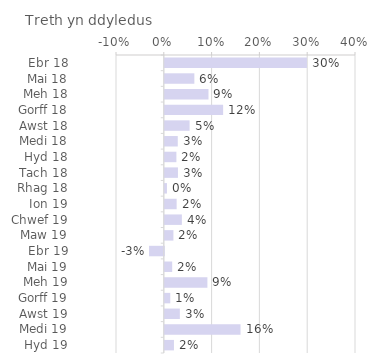
| Category | Treth yn ddyledus |
|---|---|
| Ebr 18 | 0.297 |
| Mai 18 | 0.062 |
| Meh 18 | 0.091 |
| Gorff 18 | 0.122 |
| Awst 18 | 0.052 |
| Medi 18 | 0.027 |
| Hyd 18 | 0.024 |
| Tach 18 | 0.027 |
| Rhag 18 | 0.005 |
| Ion 19 | 0.025 |
| Chwef 19 | 0.036 |
| Maw 19 | 0.018 |
| Ebr 19 | -0.031 |
| Mai 19 | 0.015 |
| Meh 19 | 0.089 |
| Gorff 19 | 0.011 |
| Awst 19 | 0.031 |
| Medi 19 | 0.158 |
| Hyd 19 | 0.019 |